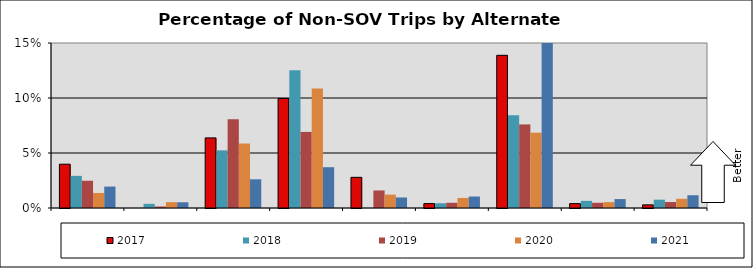
| Category | 2017 | 2018 | 2019 | 2020 | 2021 |
|---|---|---|---|---|---|
| AFV | 0.04 | 0.029 | 0.025 | 0.014 | 0.019 |
| Bicycle | 0 | 0.004 | 0.001 | 0.005 | 0.005 |
| Bus | 0.064 | 0.052 | 0.081 | 0.059 | 0.026 |
| Carpool | 0.1 | 0.125 | 0.069 | 0.109 | 0.037 |
| CWW | 0.028 | 0 | 0.016 | 0.012 | 0.01 |
| Light Rail | 0.004 | 0.004 | 0.005 | 0.009 | 0.01 |
| Telework | 0.139 | 0.084 | 0.076 | 0.068 | 0.508 |
| Vanpool | 0.004 | 0.006 | 0.005 | 0.005 | 0.008 |
| Walk | 0.003 | 0.008 | 0.005 | 0.008 | 0.012 |